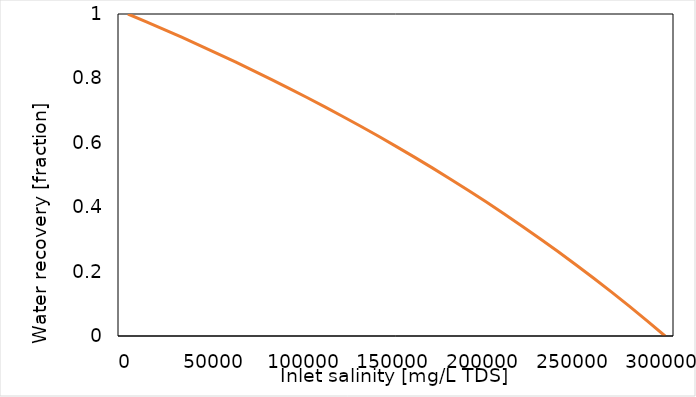
| Category | water recovery [fraction] |
|---|---|
| 0.0 | 1 |
| 10000.0 | 0.976 |
| 20000.0 | 0.952 |
| 30000.0 | 0.928 |
| 40000.0 | 0.903 |
| 50000.0 | 0.877 |
| 60000.0 | 0.851 |
| 70000.0 | 0.824 |
| 80000.0 | 0.797 |
| 90000.0 | 0.769 |
| 100000.0 | 0.741 |
| 110000.0 | 0.712 |
| 120000.0 | 0.682 |
| 130000.0 | 0.651 |
| 140000.0 | 0.62 |
| 150000.0 | 0.588 |
| 160000.0 | 0.556 |
| 170000.0 | 0.522 |
| 180000.0 | 0.488 |
| 190000.0 | 0.453 |
| 200000.0 | 0.417 |
| 210000.0 | 0.38 |
| 220000.0 | 0.342 |
| 230000.0 | 0.303 |
| 240000.0 | 0.263 |
| 250000.0 | 0.222 |
| 260000.0 | 0.18 |
| 270000.0 | 0.137 |
| 280000.0 | 0.093 |
| 290000.0 | 0.047 |
| 300000.0 | 0 |